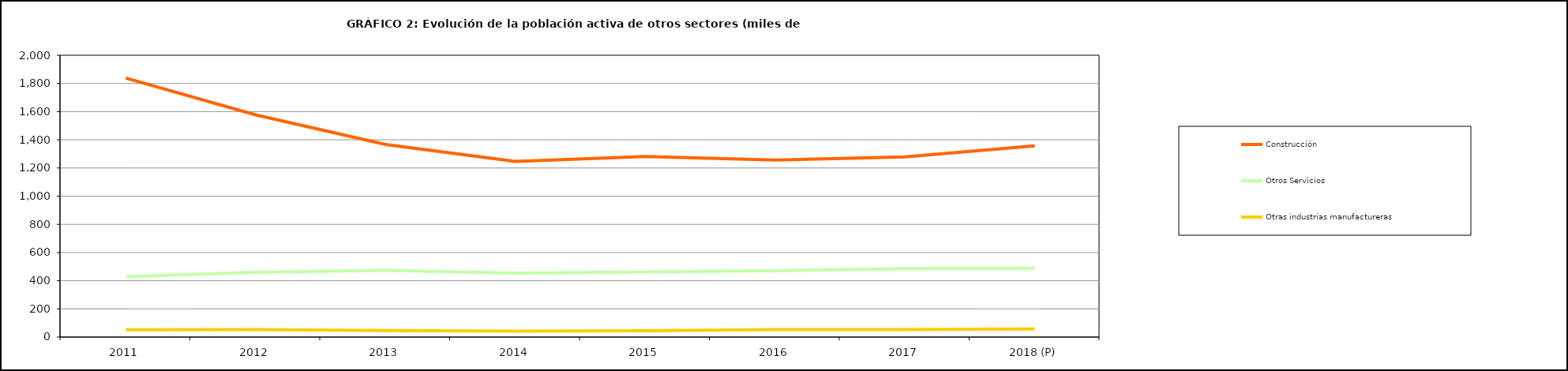
| Category | Construcción | Otros Servicios | Otras industrias manufactureras |
|---|---|---|---|
| 2011 | 1837.95 | 428.625 | 52.3 |
| 2012 | 1576.925 | 459.15 | 52.8 |
| 2013 | 1366.878 | 473.15 | 46.85 |
| 2014 | 1247.2 | 454.2 | 42.2 |
| 2015 | 1280.975 | 462.325 | 44.95 |
| 2016 | 1256.45 | 471.23 | 52.98 |
| 2017 | 1278.6 | 486.4 | 52.6 |
| 2018 (P) | 1356.625 | 486.875 | 57 |